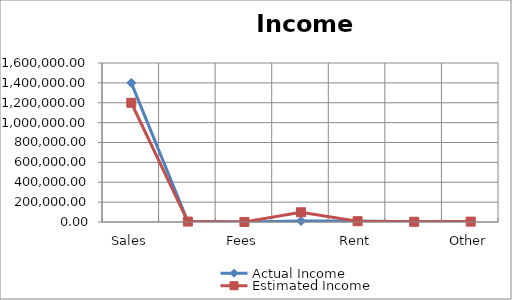
| Category | Actual Income | Estimated Income |
|---|---|---|
| Sales | 1400000 | 1200000 |
| Interest | 5000 | 4500 |
| Fees | 1000 | 980 |
| Commissions | 10000 | 98000 |
| Rent | 9000 | 8000 |
| Royalties | 2500 | 2600 |
| Other | 5000 | 4000 |